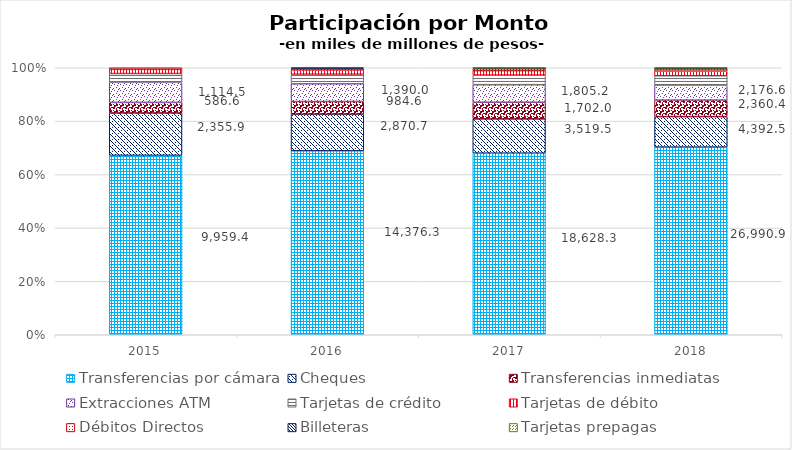
| Category | Transferencias por cámara | Cheques | Transferencias inmediatas | Extracciones ATM | Tarjetas de crédito | Tarjetas de débito | Débitos Directos | Billeteras | Tarjetas prepagas |
|---|---|---|---|---|---|---|---|---|---|
| 2015.0 | 9959.357 | 2355.883 | 586.633 | 1114.544 | 486.52 | 232.633 | 88.959 | 0 | 0 |
| 2016.0 | 14376.349 | 2870.699 | 984.604 | 1389.986 | 744.588 | 326.608 | 134.649 | 42.365 | 0 |
| 2017.0 | 18628.339 | 3519.452 | 1702.047 | 1805.152 | 983.579 | 455.278 | 208.982 | 78.375 | 7.695 |
| 2018.0 | 26990.935 | 4392.451 | 2360.415 | 2176.573 | 1337.369 | 662.4 | 326.931 | 144.297 | 15.226 |